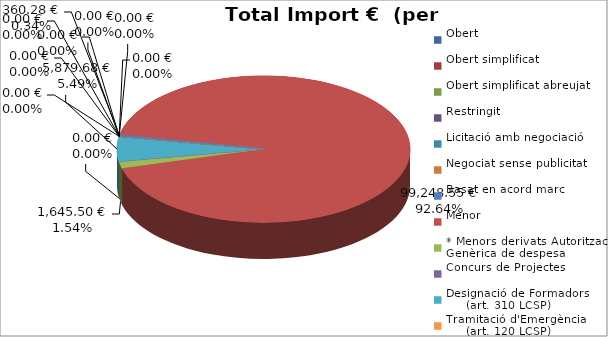
| Category | Total preu
(amb IVA) |
|---|---|
| Obert | 0 |
| Obert simplificat | 0 |
| Obert simplificat abreujat | 0 |
| Restringit | 0 |
| Licitació amb negociació | 0 |
| Negociat sense publicitat | 0 |
| Basat en acord marc | 360.28 |
| Menor | 99248.55 |
| * Menors derivats Autorització Genèrica de despesa | 1645.5 |
| Concurs de Projectes | 0 |
| Designació de Formadors
     (art. 310 LCSP) | 5879.68 |
| Tramitació d'Emergència
     (art. 120 LCSP) | 0 |